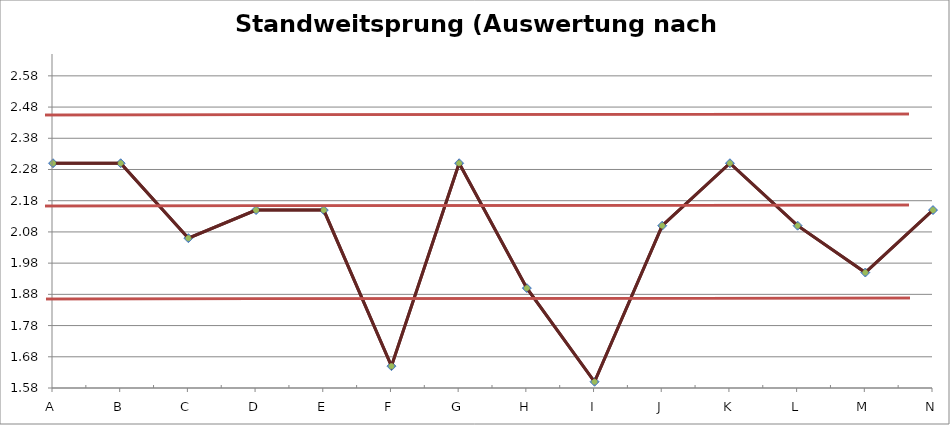
| Category | Standweitsprung |
|---|---|
| A | 2.3 |
| B | 2.3 |
| C | 2.06 |
| D | 2.15 |
| E | 2.15 |
| F | 1.65 |
| G | 2.3 |
| H | 1.9 |
| I | 1.6 |
| J | 2.1 |
| K | 2.3 |
| L | 2.1 |
| M | 1.95 |
| N | 2.15 |